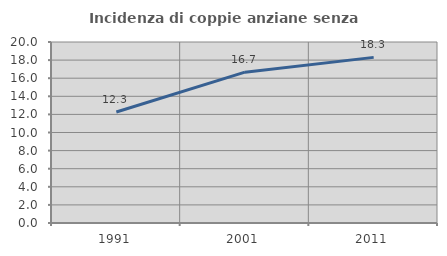
| Category | Incidenza di coppie anziane senza figli  |
|---|---|
| 1991.0 | 12.27 |
| 2001.0 | 16.667 |
| 2011.0 | 18.301 |